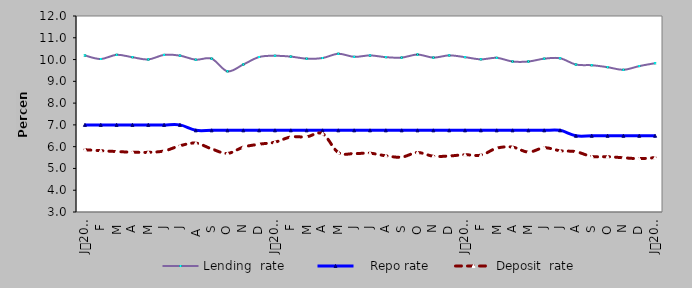
| Category | Lending  rate |    Repo rate | Deposit  rate |
|---|---|---|---|
| 0 | 10.187 | 7 | 5.858 |
| 1900-01-01 | 10.024 | 7 | 5.815 |
| 1900-01-02 | 10.218 | 7 | 5.776 |
| 1900-01-03 | 10.107 | 7 | 5.746 |
| 1900-01-04 | 10.004 | 7 | 5.74 |
| 1900-01-05 | 10.214 | 7 | 5.804 |
| 1900-01-06 | 10.18 | 7 | 6.04 |
| 1900-01-07 | 9.994 | 6.75 | 6.162 |
| 1900-01-08 | 10.042 | 6.75 | 5.898 |
| 1900-01-09 | 9.46 | 6.75 | 5.69 |
| 1900-01-10 | 9.774 | 6.75 | 5.98 |
| 1900-01-11 | 10.117 | 6.75 | 6.113 |
| 1900-01-12 | 10.174 | 6.75 | 6.207 |
| 1900-01-13 | 10.136 | 6.75 | 6.446 |
| 1900-01-14 | 10.04 | 6.75 | 6.45 |
| 1900-01-15 | 10.07 | 6.75 | 6.6 |
| 1900-01-16 | 10.265 | 6.75 | 5.728 |
| 1900-01-17 | 10.125 | 6.75 | 5.682 |
| 1900-01-18 | 10.19 | 6.75 | 5.7 |
| 1900-01-19 | 10.11 | 6.75 | 5.58 |
| 1900-01-20 | 10.09 | 6.75 | 5.52 |
| 1900-01-21 | 10.23 | 6.75 | 5.73 |
| 1900-01-22 | 10.09 | 6.75 | 5.56 |
| 1900-01-23 | 10.192 | 6.75 | 5.572 |
| 1900-01-24 | 10.11 | 6.75 | 5.63 |
| 1900-01-25 | 10.01 | 6.75 | 5.61 |
| 1900-01-26 | 10.08 | 6.75 | 5.93 |
| 1900-01-27 | 9.91 | 6.75 | 5.98 |
| 1900-01-28 | 9.91 | 6.75 | 5.75 |
| 1900-01-29 | 10.04 | 6.75 | 5.95 |
| 1900-01-30 | 10.06 | 6.75 | 5.813 |
| 1900-01-31 | 9.77 | 6.5 | 5.77 |
| 1900-02-01 | 9.74 | 6.5 | 5.55 |
| 1900-02-02 | 9.65 | 6.5 | 5.54 |
| 1900-02-03 | 9.53 | 6.5 | 5.49 |
| 1900-02-04 | 9.7 | 6.5 | 5.45 |
| 1900-02-05 | 9.833 | 6.5 | 5.497 |